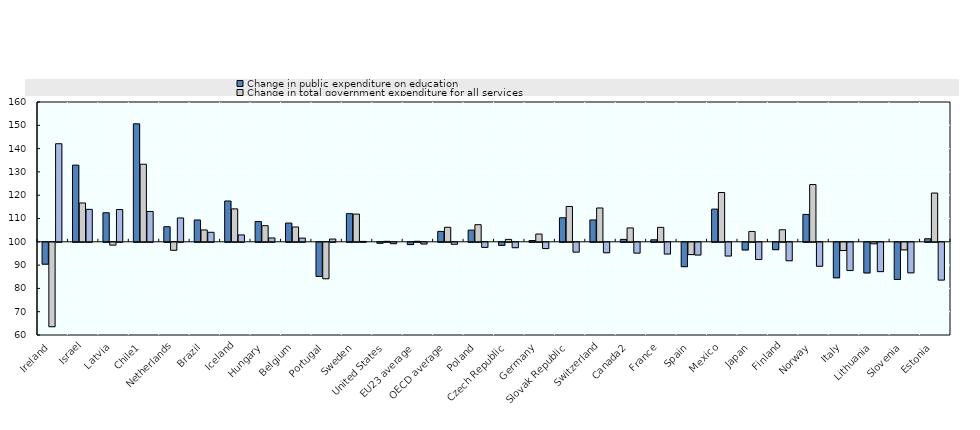
| Category | Change in public expenditure on education | Change in total government expenditure for all services | Change in total public expenditure on education as a percentage of total government expenditure |
|---|---|---|---|
| Ireland | 90.607 | 63.768 | 142.089 |
| Israel | 132.907 | 116.665 | 113.922 |
| Latvia | 112.472 | 98.795 | 113.844 |
| Chile1 | 150.641 | 133.292 | 113.016 |
| Netherlands | 106.474 | 96.58 | 110.245 |
| Brazil | 109.367 | 105.081 | 104.079 |
| Iceland | 117.517 | 114.135 | 102.964 |
| Hungary | 108.687 | 106.919 | 101.654 |
| Belgium | 108.039 | 106.352 | 101.586 |
| Portugal | 85.352 | 84.351 | 101.187 |
| Sweden | 112.081 | 111.899 | 100.163 |
| United States | 99.609 | 100.203 | 99.408 |
| EU23 average | 99.029 | 100.218 | 99.273 |
| OECD average | 104.46 | 106.225 | 99.155 |
| Poland | 105.02 | 107.351 | 97.828 |
| Czech Republic | 98.687 | 101.029 | 97.681 |
| Germany | 100.554 | 103.332 | 97.311 |
| Slovak Republic | 110.313 | 115.168 | 95.784 |
| Switzerland | 109.377 | 114.514 | 95.514 |
| Canada2 | 101.041 | 105.951 | 95.366 |
| France | 100.862 | 106.199 | 94.975 |
| Spain | 89.542 | 94.723 | 94.53 |
| Mexico | 114.027 | 121.161 | 94.112 |
| Japan | 96.719 | 104.44 | 92.607 |
| Finland | 96.84 | 105.169 | 92.08 |
| Norway | 111.751 | 124.563 | 89.714 |
| Italy | 84.767 | 96.462 | 87.876 |
| Lithuania | 86.852 | 99.36 | 87.412 |
| Slovenia | 84.062 | 96.742 | 86.893 |
| Estonia | 101.314 | 120.926 | 83.782 |